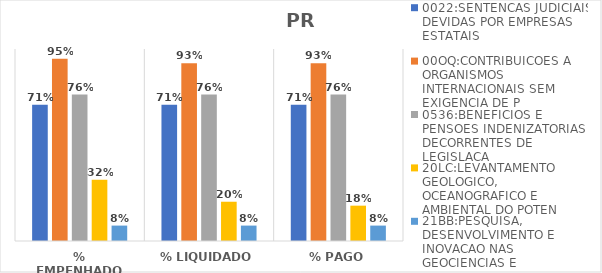
| Category | 0022:SENTENCAS JUDICIAIS DEVIDAS POR EMPRESAS ESTATAIS | 00OQ:CONTRIBUICOES A ORGANISMOS INTERNACIONAIS SEM EXIGENCIA DE P | 0536:BENEFICIOS E PENSOES INDENIZATORIAS DECORRENTES DE LEGISLACA | 20LC:LEVANTAMENTO GEOLOGICO, OCEANOGRAFICO E AMBIENTAL DO POTEN | 21BB:PESQUISA, DESENVOLVIMENTO E INOVACAO NAS GEOCIENCIAS E |
|---|---|---|---|---|---|
| % EMPENHADO | 0.71 | 0.95 | 0.763 | 0.318 | 0.08 |
| % LIQUIDADO | 0.71 | 0.926 | 0.763 | 0.205 | 0.08 |
| % PAGO | 0.71 | 0.926 | 0.763 | 0.184 | 0.08 |